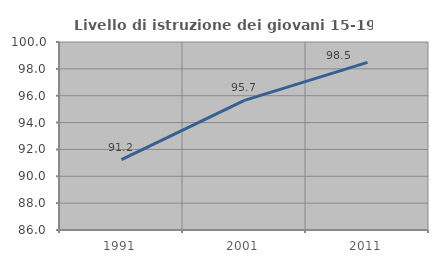
| Category | Livello di istruzione dei giovani 15-19 anni |
|---|---|
| 1991.0 | 91.241 |
| 2001.0 | 95.652 |
| 2011.0 | 98.485 |